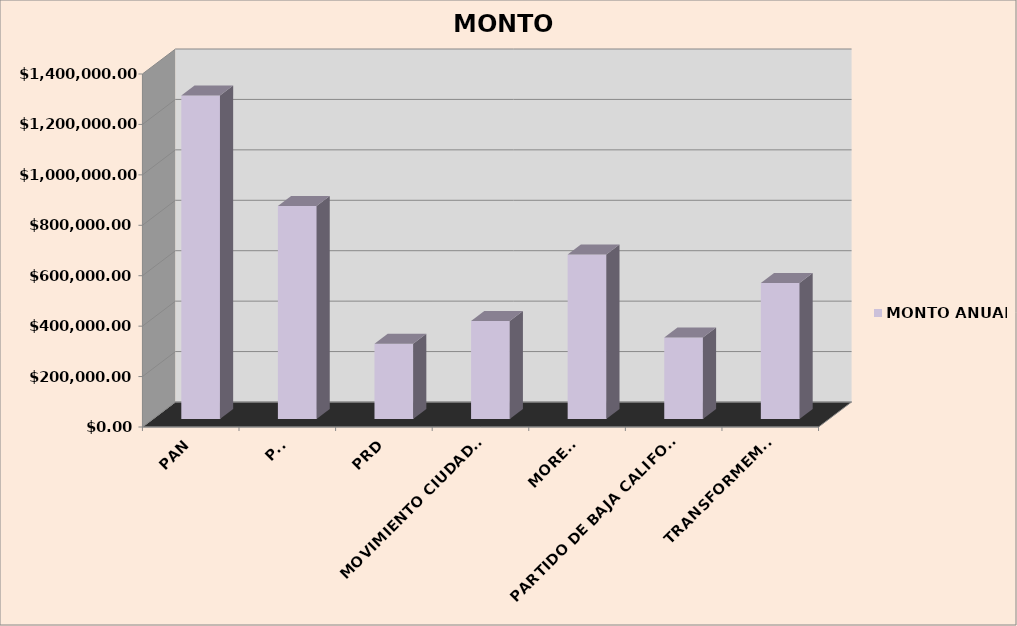
| Category | MONTO ANUAL |
|---|---|
| PAN | 1283071.34 |
| PRI | 844585.52 |
| PRD | 298151.36 |
| MOVIMIENTO CIUDADANO | 388311.32 |
| MORENA | 652522.67 |
| PARTIDO DE BAJA CALIFORNIA | 323564.62 |
| TRANSFORMEMOS  | 539282.86 |